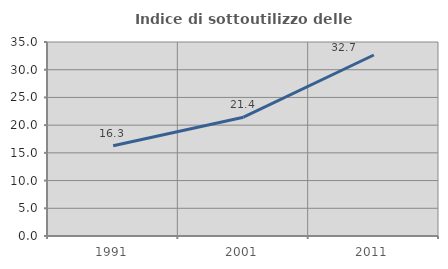
| Category | Indice di sottoutilizzo delle abitazioni  |
|---|---|
| 1991.0 | 16.295 |
| 2001.0 | 21.439 |
| 2011.0 | 32.656 |